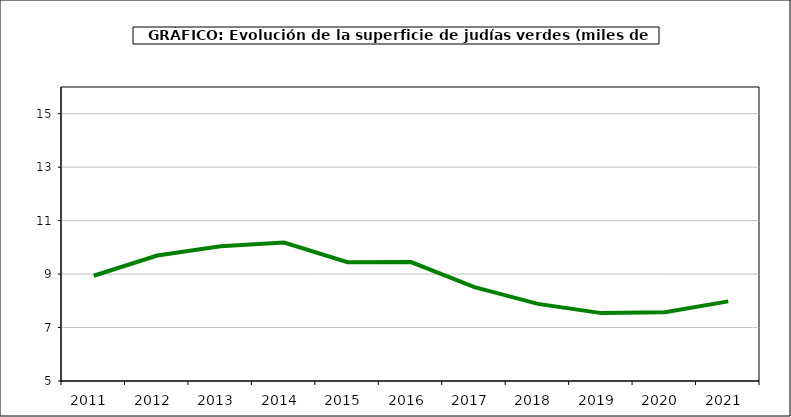
| Category | superficie |
|---|---|
| 2011.0 | 8.939 |
| 2012.0 | 9.694 |
| 2013.0 | 10.041 |
| 2014.0 | 10.18 |
| 2015.0 | 9.445 |
| 2016.0 | 9.45 |
| 2017.0 | 8.509 |
| 2018.0 | 7.885 |
| 2019.0 | 7.54 |
| 2020.0 | 7.571 |
| 2021.0 | 7.98 |